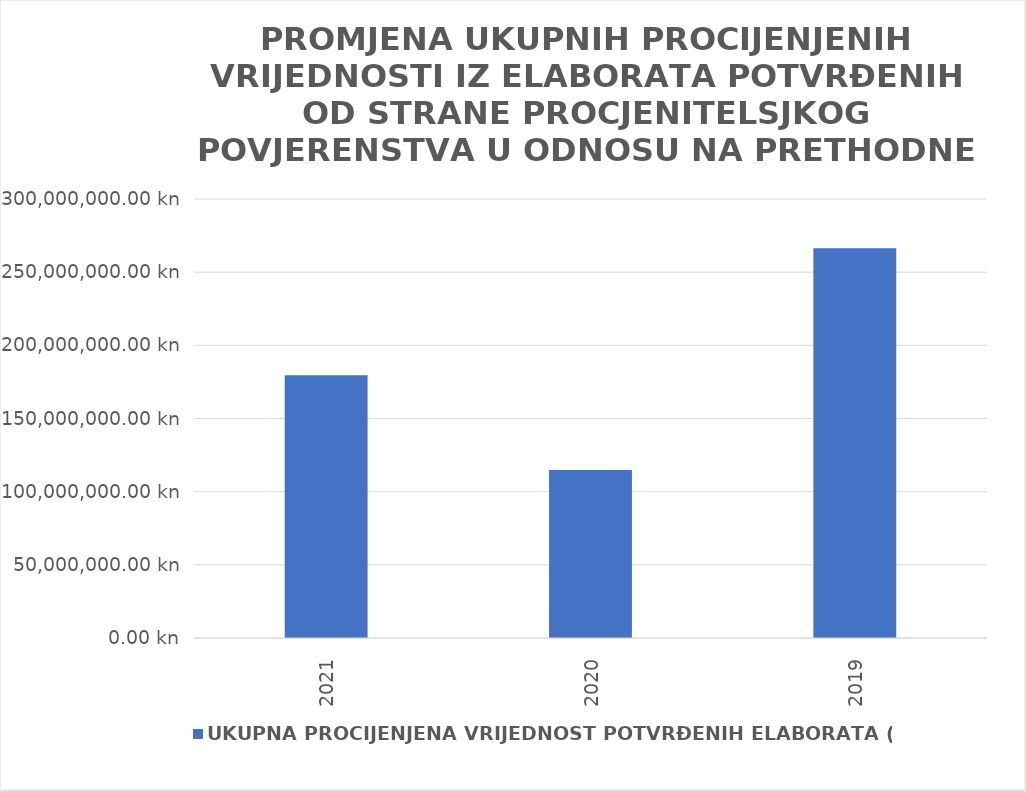
| Category | UKUPNA PROCIJENJENA VRIJEDNOST POTVRĐENIH ELABORATA (u kn) |
|---|---|
| 2021.0 | 179537765 |
| 2020.0 | 114765506.45 |
| 2019.0 | 266265356 |